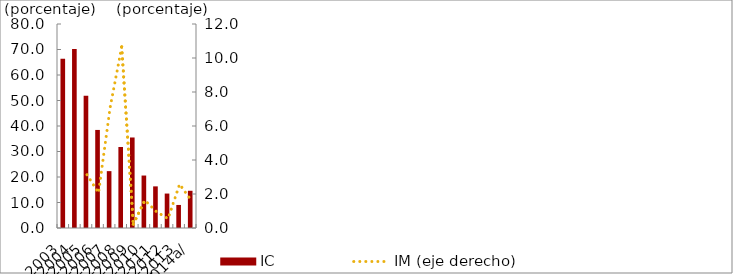
| Category | IC |
|---|---|
| 2003 | 66.369 |
| 2004 | 70.208 |
| 2005 | 51.874 |
| 2006 | 38.457 |
| 2007 | 22.299 |
| 2008 | 31.775 |
| 2009 | 35.496 |
| 2010 | 20.574 |
| 2011 | 16.323 |
| 2012 | 13.508 |
| 2013 | 9.036 |
| 2014a/ | 14.6 |